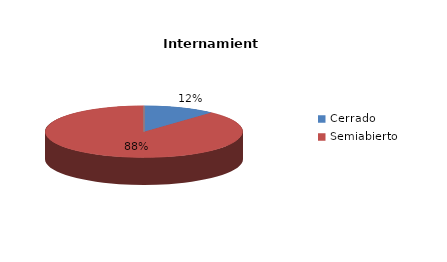
| Category | Series 0 |
|---|---|
| Cerrado | 2 |
| Semiabierto | 15 |
| Abierto | 0 |
| Terapeúticos | 0 |